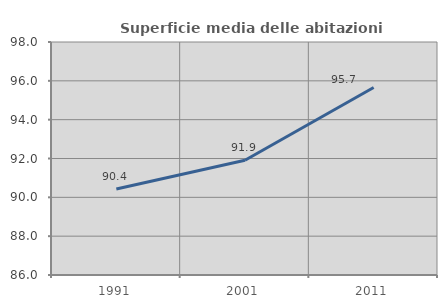
| Category | Superficie media delle abitazioni occupate |
|---|---|
| 1991.0 | 90.433 |
| 2001.0 | 91.911 |
| 2011.0 | 95.657 |